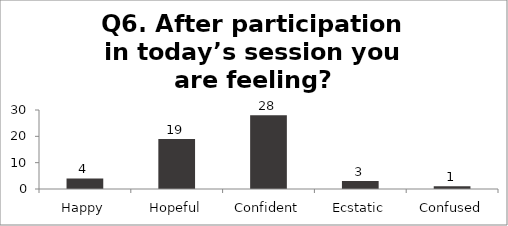
| Category | Q6. After participation in today’s session you are feeling? |
|---|---|
| Happy | 4 |
| Hopeful | 19 |
| Confident | 28 |
| Ecstatic | 3 |
| Confused | 1 |